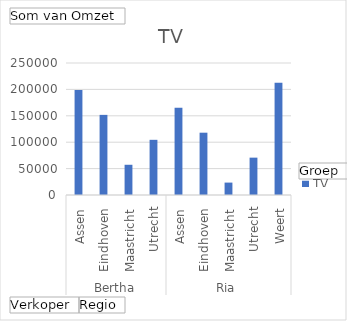
| Category | TV |
|---|---|
| 0 | 199000 |
| 1 | 151750 |
| 2 | 57250 |
| 3 | 104500 |
| 4 | 165250 |
| 5 | 118000 |
| 6 | 23500 |
| 7 | 70750 |
| 8 | 212500 |